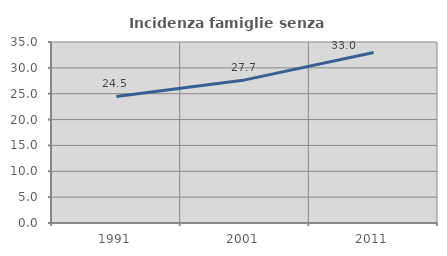
| Category | Incidenza famiglie senza nuclei |
|---|---|
| 1991.0 | 24.475 |
| 2001.0 | 27.672 |
| 2011.0 | 32.953 |